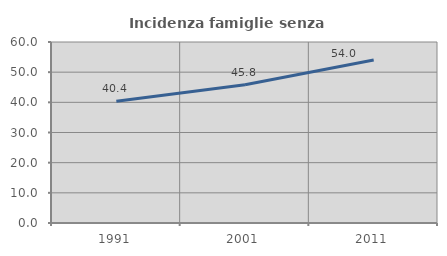
| Category | Incidenza famiglie senza nuclei |
|---|---|
| 1991.0 | 40.381 |
| 2001.0 | 45.833 |
| 2011.0 | 54.02 |